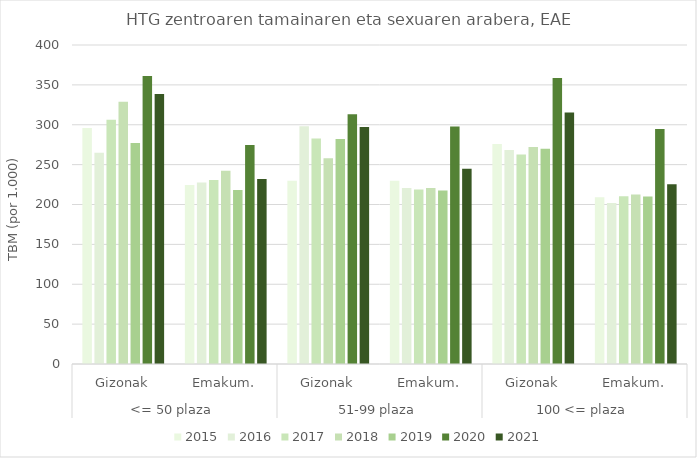
| Category | 2015 | 2016 | 2017 | 2018 | 2019 | 2020 | 2021 |
|---|---|---|---|---|---|---|---|
| 0 | 295.905 | 264.909 | 306.413 | 328.722 | 277.121 | 361.204 | 338.673 |
| 1 | 224.385 | 227.712 | 230.833 | 242.174 | 218.049 | 274.525 | 231.908 |
| 2 | 229.778 | 298.087 | 282.732 | 258.065 | 282.028 | 313.157 | 297.189 |
| 3 | 229.685 | 220.803 | 218.923 | 220.561 | 217.448 | 297.652 | 244.898 |
| 4 | 275.901 | 268.478 | 262.723 | 272.008 | 269.951 | 358.591 | 315.495 |
| 5 | 209.203 | 201.976 | 210.335 | 212.454 | 209.939 | 294.741 | 225.36 |